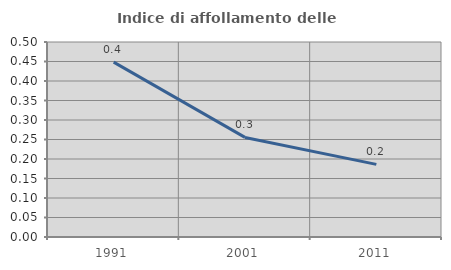
| Category | Indice di affollamento delle abitazioni  |
|---|---|
| 1991.0 | 0.448 |
| 2001.0 | 0.255 |
| 2011.0 | 0.186 |